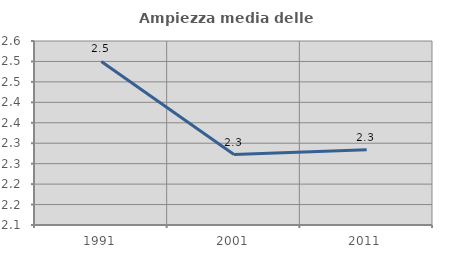
| Category | Ampiezza media delle famiglie |
|---|---|
| 1991.0 | 2.5 |
| 2001.0 | 2.272 |
| 2011.0 | 2.284 |